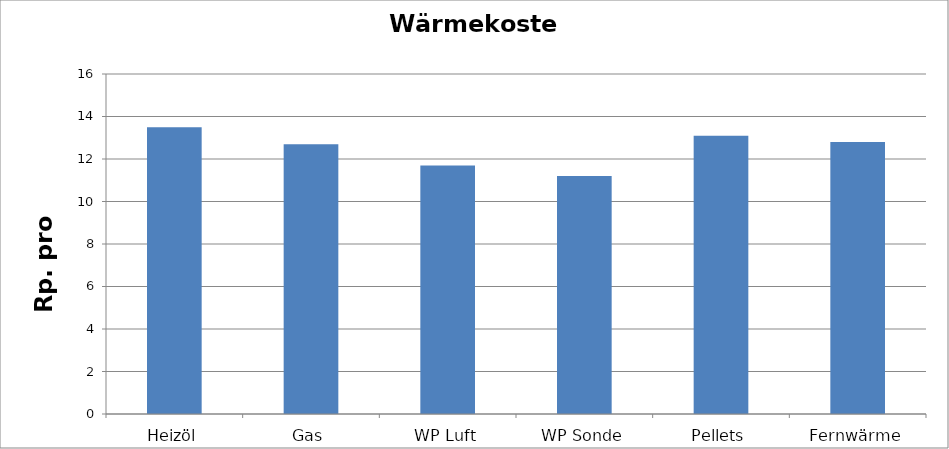
| Category | Wärmekosten [Rp./kWh] |
|---|---|
| Heizöl | 13.5 |
| Gas | 12.7 |
| WP Luft | 11.7 |
| WP Sonde | 11.2 |
| Pellets | 13.1 |
| Fernwärme | 12.8 |